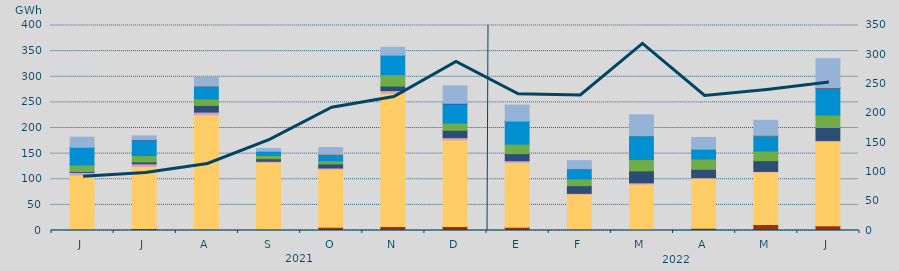
| Category | Carbón | Ciclo Combinado | Cogeneración | Consumo Bombeo | Eólica | Hidráulica | Nuclear | Solar fotovoltaica | Solar térmica | Turbinación bombeo |
|---|---|---|---|---|---|---|---|---|---|---|
| J | 2620 | 105576.1 | 5187.8 | 1697 | 12843.8 | 33778.9 | 555 | 0 | 0 | 19791.2 |
| J | 3730 | 121314.8 | 5025 | 3708.5 | 12369.9 | 30030.1 | 967.6 | 0 | 0 | 7404.9 |
| A | 2239.6 | 223722.7 | 5084 | 13015.2 | 12519 | 25553.5 | 0 | 57 | 0 | 16638.9 |
| S | 2513.5 | 130905.6 | 1691.3 | 4917 | 6277.1 | 8332.4 | 87 | 26 | 0 | 5316.1 |
| O | 6371.9 | 113565.2 | 2101.6 | 7861 | 6030.7 | 12656.8 | 0 | 469.9 | 0 | 12892.5 |
| N | 7794.3 | 260394.8 | 4761.9 | 8865.5 | 22305.4 | 37370.7 | 0 | 1030.6 | 0 | 14816.5 |
| D | 7972.1 | 169088.6 | 4082.4 | 14411.7 | 14056.2 | 37289.7 | 1050 | 631.2 | 0 | 33677.5 |
| E | 6570.2 | 126286.6 | 3356.8 | 13716.6 | 18556.1 | 44421.9 | 42 | 928.6 | 0 | 30908.5 |
| F | 2568.1 | 68716.7 | 1177.2 | 14975 | 13257.2 | 19925.5 | 0 | 116 | 0 | 15456.1 |
| M | 1920.2 | 88833.3 | 2368.3 | 23235.2 | 22069.1 | 46579.6 | 0 | 131 | 0 | 40486 |
| A | 4593.5 | 97889.1 | 405.8 | 16475.5 | 19937.3 | 18601.3 | 663.3 | 233.1 | 0 | 22786.5 |
| M | 11875.65 | 102430.975 | 928.85 | 21079.775 | 18647.725 | 29842.925 | 0 | 1098.75 | 0 | 29000.65 |
| J | 9138.825 | 164797.65 | 1808.4 | 25204.95 | 24371.3 | 52553.275 | 599.625 | 596 | 0 | 56106.775 |